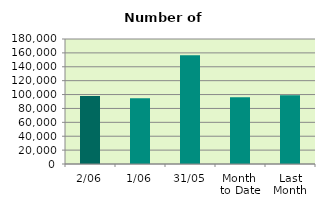
| Category | Series 0 |
|---|---|
| 2/06 | 97938 |
| 1/06 | 94574 |
| 31/05 | 156558 |
| Month 
to Date | 96256 |
| Last
Month | 98885.545 |